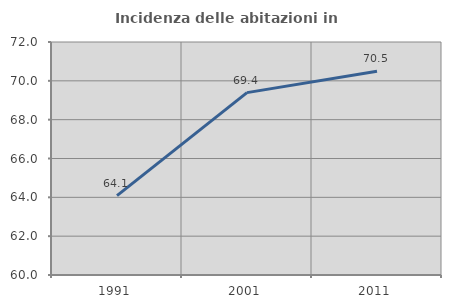
| Category | Incidenza delle abitazioni in proprietà  |
|---|---|
| 1991.0 | 64.087 |
| 2001.0 | 69.393 |
| 2011.0 | 70.489 |